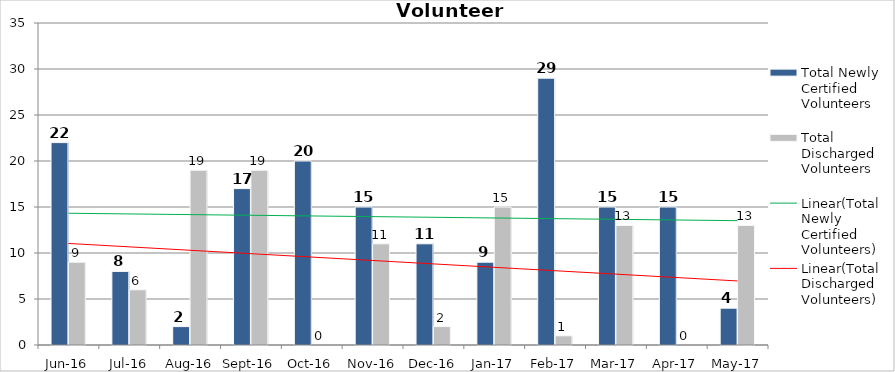
| Category | Total Newly Certified Volunteers | Total Discharged Volunteers |
|---|---|---|
| Jun-16 | 22 | 9 |
| Jul-16 | 8 | 6 |
| Aug-16 | 2 | 19 |
| Sep-16 | 17 | 19 |
| Oct-16 | 20 | 0 |
| Nov-16 | 15 | 11 |
| Dec-16 | 11 | 2 |
| Jan-17 | 9 | 15 |
| Feb-17 | 29 | 1 |
| Mar-17 | 15 | 13 |
| Apr-17 | 15 | 0 |
| May-17 | 4 | 13 |